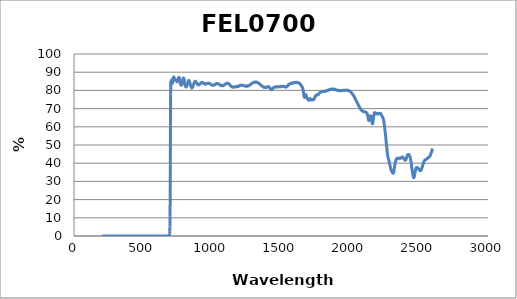
| Category | Series 0 |
|---|---|
| 2600.0 | 48.005 |
| 2599.0 | 47.872 |
| 2598.0 | 47.771 |
| 2597.0 | 47.591 |
| 2596.0 | 47.371 |
| 2595.0 | 47.221 |
| 2594.0 | 47.02 |
| 2593.0 | 46.818 |
| 2592.0 | 46.589 |
| 2591.0 | 46.38 |
| 2590.0 | 46.118 |
| 2589.0 | 45.875 |
| 2588.0 | 45.628 |
| 2587.0 | 45.402 |
| 2586.0 | 45.179 |
| 2585.0 | 44.964 |
| 2584.0 | 44.723 |
| 2583.0 | 44.506 |
| 2582.0 | 44.365 |
| 2581.0 | 44.17 |
| 2580.0 | 44.04 |
| 2579.0 | 43.906 |
| 2578.0 | 43.796 |
| 2577.0 | 43.674 |
| 2576.0 | 43.643 |
| 2575.0 | 43.505 |
| 2574.0 | 43.43 |
| 2573.0 | 43.443 |
| 2572.0 | 43.408 |
| 2571.0 | 43.345 |
| 2570.0 | 43.26 |
| 2569.0 | 43.187 |
| 2568.0 | 43.197 |
| 2567.0 | 43.044 |
| 2566.0 | 42.969 |
| 2565.0 | 42.871 |
| 2564.0 | 42.82 |
| 2563.0 | 42.755 |
| 2562.0 | 42.705 |
| 2561.0 | 42.603 |
| 2560.0 | 42.515 |
| 2559.0 | 42.503 |
| 2558.0 | 42.401 |
| 2557.0 | 42.373 |
| 2556.0 | 42.283 |
| 2555.0 | 42.256 |
| 2554.0 | 42.219 |
| 2553.0 | 42.184 |
| 2552.0 | 42.097 |
| 2551.0 | 42.037 |
| 2550.0 | 42.054 |
| 2549.0 | 42.051 |
| 2548.0 | 41.978 |
| 2547.0 | 41.938 |
| 2546.0 | 41.916 |
| 2545.0 | 41.809 |
| 2544.0 | 41.795 |
| 2543.0 | 41.687 |
| 2542.0 | 41.621 |
| 2541.0 | 41.537 |
| 2540.0 | 41.441 |
| 2539.0 | 41.293 |
| 2538.0 | 41.202 |
| 2537.0 | 41.012 |
| 2536.0 | 40.91 |
| 2535.0 | 40.717 |
| 2534.0 | 40.534 |
| 2533.0 | 40.259 |
| 2532.0 | 40.103 |
| 2531.0 | 39.814 |
| 2530.0 | 39.647 |
| 2529.0 | 39.354 |
| 2528.0 | 39.082 |
| 2527.0 | 38.84 |
| 2526.0 | 38.595 |
| 2525.0 | 38.302 |
| 2524.0 | 38.057 |
| 2523.0 | 37.806 |
| 2522.0 | 37.62 |
| 2521.0 | 37.328 |
| 2520.0 | 37.102 |
| 2519.0 | 36.885 |
| 2518.0 | 36.681 |
| 2517.0 | 36.505 |
| 2516.0 | 36.358 |
| 2515.0 | 36.166 |
| 2514.0 | 36.042 |
| 2513.0 | 35.998 |
| 2512.0 | 35.957 |
| 2511.0 | 35.893 |
| 2510.0 | 35.892 |
| 2509.0 | 35.866 |
| 2508.0 | 35.903 |
| 2507.0 | 35.905 |
| 2506.0 | 36.005 |
| 2505.0 | 36.111 |
| 2504.0 | 36.16 |
| 2503.0 | 36.238 |
| 2502.0 | 36.366 |
| 2501.0 | 36.418 |
| 2500.0 | 36.547 |
| 2499.0 | 36.677 |
| 2498.0 | 36.777 |
| 2497.0 | 36.83 |
| 2496.0 | 36.892 |
| 2495.0 | 37.019 |
| 2494.0 | 37.071 |
| 2493.0 | 37.173 |
| 2492.0 | 37.254 |
| 2491.0 | 37.316 |
| 2490.0 | 37.394 |
| 2489.0 | 37.493 |
| 2488.0 | 37.528 |
| 2487.0 | 37.571 |
| 2486.0 | 37.656 |
| 2485.0 | 37.662 |
| 2484.0 | 37.69 |
| 2483.0 | 37.7 |
| 2482.0 | 37.683 |
| 2481.0 | 37.59 |
| 2480.0 | 37.412 |
| 2479.0 | 37.259 |
| 2478.0 | 37.113 |
| 2477.0 | 36.78 |
| 2476.0 | 36.525 |
| 2475.0 | 36.191 |
| 2474.0 | 35.817 |
| 2473.0 | 35.444 |
| 2472.0 | 35.022 |
| 2471.0 | 34.652 |
| 2470.0 | 34.194 |
| 2469.0 | 33.805 |
| 2468.0 | 33.363 |
| 2467.0 | 32.94 |
| 2466.0 | 32.685 |
| 2465.0 | 32.392 |
| 2464.0 | 32.188 |
| 2463.0 | 32.063 |
| 2462.0 | 31.979 |
| 2461.0 | 32.038 |
| 2460.0 | 32.182 |
| 2459.0 | 32.41 |
| 2458.0 | 32.675 |
| 2457.0 | 33.006 |
| 2456.0 | 33.407 |
| 2455.0 | 33.879 |
| 2454.0 | 34.374 |
| 2453.0 | 34.839 |
| 2452.0 | 35.349 |
| 2451.0 | 35.854 |
| 2450.0 | 36.426 |
| 2449.0 | 36.967 |
| 2448.0 | 37.536 |
| 2447.0 | 38.135 |
| 2446.0 | 38.718 |
| 2445.0 | 39.308 |
| 2444.0 | 39.785 |
| 2443.0 | 40.401 |
| 2442.0 | 40.879 |
| 2441.0 | 41.401 |
| 2440.0 | 41.815 |
| 2439.0 | 42.241 |
| 2438.0 | 42.603 |
| 2437.0 | 42.917 |
| 2436.0 | 43.163 |
| 2435.0 | 43.418 |
| 2434.0 | 43.666 |
| 2433.0 | 43.901 |
| 2432.0 | 43.994 |
| 2431.0 | 44.245 |
| 2430.0 | 44.315 |
| 2429.0 | 44.448 |
| 2428.0 | 44.547 |
| 2427.0 | 44.669 |
| 2426.0 | 44.713 |
| 2425.0 | 44.789 |
| 2424.0 | 44.786 |
| 2423.0 | 44.801 |
| 2422.0 | 44.782 |
| 2421.0 | 44.771 |
| 2420.0 | 44.701 |
| 2419.0 | 44.695 |
| 2418.0 | 44.582 |
| 2417.0 | 44.453 |
| 2416.0 | 44.412 |
| 2415.0 | 44.256 |
| 2414.0 | 44.059 |
| 2413.0 | 43.908 |
| 2412.0 | 43.686 |
| 2411.0 | 43.456 |
| 2410.0 | 43.176 |
| 2409.0 | 42.955 |
| 2408.0 | 42.647 |
| 2407.0 | 42.386 |
| 2406.0 | 42.219 |
| 2405.0 | 41.949 |
| 2404.0 | 41.834 |
| 2403.0 | 41.672 |
| 2402.0 | 41.612 |
| 2401.0 | 41.582 |
| 2400.0 | 41.645 |
| 2399.0 | 41.666 |
| 2398.0 | 41.721 |
| 2397.0 | 41.854 |
| 2396.0 | 41.888 |
| 2395.0 | 42.018 |
| 2394.0 | 42.13 |
| 2393.0 | 42.253 |
| 2392.0 | 42.304 |
| 2391.0 | 42.448 |
| 2390.0 | 42.525 |
| 2389.0 | 42.6 |
| 2388.0 | 42.726 |
| 2387.0 | 42.806 |
| 2386.0 | 42.928 |
| 2385.0 | 43.014 |
| 2384.0 | 43.129 |
| 2383.0 | 43.171 |
| 2382.0 | 43.291 |
| 2381.0 | 43.361 |
| 2380.0 | 43.362 |
| 2379.0 | 43.436 |
| 2378.0 | 43.432 |
| 2377.0 | 43.395 |
| 2376.0 | 43.346 |
| 2375.0 | 43.308 |
| 2374.0 | 43.173 |
| 2373.0 | 43.153 |
| 2372.0 | 43.08 |
| 2371.0 | 43.033 |
| 2370.0 | 42.989 |
| 2369.0 | 42.909 |
| 2368.0 | 42.748 |
| 2367.0 | 42.768 |
| 2366.0 | 42.672 |
| 2365.0 | 42.643 |
| 2364.0 | 42.683 |
| 2363.0 | 42.692 |
| 2362.0 | 42.724 |
| 2361.0 | 42.775 |
| 2360.0 | 42.839 |
| 2359.0 | 42.799 |
| 2358.0 | 42.874 |
| 2357.0 | 42.816 |
| 2356.0 | 42.799 |
| 2355.0 | 42.73 |
| 2354.0 | 42.593 |
| 2353.0 | 42.553 |
| 2352.0 | 42.507 |
| 2351.0 | 42.449 |
| 2350.0 | 42.456 |
| 2349.0 | 42.505 |
| 2348.0 | 42.48 |
| 2347.0 | 42.568 |
| 2346.0 | 42.605 |
| 2345.0 | 42.582 |
| 2344.0 | 42.67 |
| 2343.0 | 42.698 |
| 2342.0 | 42.732 |
| 2341.0 | 42.723 |
| 2340.0 | 42.734 |
| 2339.0 | 42.681 |
| 2338.0 | 42.56 |
| 2337.0 | 42.512 |
| 2336.0 | 42.344 |
| 2335.0 | 42.177 |
| 2334.0 | 41.955 |
| 2333.0 | 41.695 |
| 2332.0 | 41.391 |
| 2331.0 | 41.151 |
| 2330.0 | 40.895 |
| 2329.0 | 40.585 |
| 2328.0 | 40.274 |
| 2327.0 | 39.89 |
| 2326.0 | 39.414 |
| 2325.0 | 39.023 |
| 2324.0 | 38.596 |
| 2323.0 | 38.038 |
| 2322.0 | 37.555 |
| 2321.0 | 37 |
| 2320.0 | 36.476 |
| 2319.0 | 35.925 |
| 2318.0 | 35.455 |
| 2317.0 | 35.081 |
| 2316.0 | 34.789 |
| 2315.0 | 34.597 |
| 2314.0 | 34.463 |
| 2313.0 | 34.446 |
| 2312.0 | 34.524 |
| 2311.0 | 34.551 |
| 2310.0 | 34.645 |
| 2309.0 | 34.761 |
| 2308.0 | 34.876 |
| 2307.0 | 35.02 |
| 2306.0 | 35.084 |
| 2305.0 | 35.18 |
| 2304.0 | 35.311 |
| 2303.0 | 35.458 |
| 2302.0 | 35.546 |
| 2301.0 | 35.7 |
| 2300.0 | 35.85 |
| 2299.0 | 36.049 |
| 2298.0 | 36.312 |
| 2297.0 | 36.51 |
| 2296.0 | 36.751 |
| 2295.0 | 37.062 |
| 2294.0 | 37.386 |
| 2293.0 | 37.659 |
| 2292.0 | 38.016 |
| 2291.0 | 38.338 |
| 2290.0 | 38.741 |
| 2289.0 | 39.044 |
| 2288.0 | 39.413 |
| 2287.0 | 39.741 |
| 2286.0 | 40.118 |
| 2285.0 | 40.458 |
| 2284.0 | 40.855 |
| 2283.0 | 41.158 |
| 2282.0 | 41.463 |
| 2281.0 | 41.737 |
| 2280.0 | 42.043 |
| 2279.0 | 42.338 |
| 2278.0 | 42.597 |
| 2277.0 | 42.827 |
| 2276.0 | 43.151 |
| 2275.0 | 43.437 |
| 2274.0 | 43.778 |
| 2273.0 | 44.267 |
| 2272.0 | 44.709 |
| 2271.0 | 45.294 |
| 2270.0 | 45.875 |
| 2269.0 | 46.54 |
| 2268.0 | 47.256 |
| 2267.0 | 48.064 |
| 2266.0 | 48.796 |
| 2265.0 | 49.593 |
| 2264.0 | 50.315 |
| 2263.0 | 51.122 |
| 2262.0 | 51.908 |
| 2261.0 | 52.751 |
| 2260.0 | 53.498 |
| 2259.0 | 54.155 |
| 2258.0 | 54.961 |
| 2257.0 | 55.673 |
| 2256.0 | 56.409 |
| 2255.0 | 57.168 |
| 2254.0 | 57.853 |
| 2253.0 | 58.53 |
| 2252.0 | 59.228 |
| 2251.0 | 59.81 |
| 2250.0 | 60.463 |
| 2249.0 | 61.03 |
| 2248.0 | 61.614 |
| 2247.0 | 62.042 |
| 2246.0 | 62.6 |
| 2245.0 | 63.003 |
| 2244.0 | 63.293 |
| 2243.0 | 63.746 |
| 2242.0 | 64.051 |
| 2241.0 | 64.3 |
| 2240.0 | 64.473 |
| 2239.0 | 64.732 |
| 2238.0 | 65.02 |
| 2237.0 | 65.159 |
| 2236.0 | 65.34 |
| 2235.0 | 65.382 |
| 2234.0 | 65.591 |
| 2233.0 | 65.599 |
| 2232.0 | 65.782 |
| 2231.0 | 66.002 |
| 2230.0 | 66.148 |
| 2229.0 | 66.279 |
| 2228.0 | 66.498 |
| 2227.0 | 66.676 |
| 2226.0 | 66.839 |
| 2225.0 | 66.953 |
| 2224.0 | 67.132 |
| 2223.0 | 67.263 |
| 2222.0 | 67.302 |
| 2221.0 | 67.324 |
| 2220.0 | 67.41 |
| 2219.0 | 67.435 |
| 2218.0 | 67.452 |
| 2217.0 | 67.377 |
| 2216.0 | 67.36 |
| 2215.0 | 67.268 |
| 2214.0 | 67.187 |
| 2213.0 | 67.15 |
| 2212.0 | 67.1 |
| 2211.0 | 67.075 |
| 2210.0 | 67.026 |
| 2209.0 | 66.987 |
| 2208.0 | 67.056 |
| 2207.0 | 66.998 |
| 2206.0 | 67.114 |
| 2205.0 | 67.158 |
| 2204.0 | 67.152 |
| 2203.0 | 67.212 |
| 2202.0 | 67.276 |
| 2201.0 | 67.324 |
| 2200.0 | 67.399 |
| 2199.0 | 67.334 |
| 2198.0 | 67.338 |
| 2197.0 | 67.428 |
| 2196.0 | 67.371 |
| 2195.0 | 67.3 |
| 2194.0 | 67.268 |
| 2193.0 | 67.147 |
| 2192.0 | 67.062 |
| 2191.0 | 67.048 |
| 2190.0 | 67.041 |
| 2189.0 | 67.078 |
| 2188.0 | 67.078 |
| 2187.0 | 67.239 |
| 2186.0 | 67.278 |
| 2185.0 | 67.366 |
| 2184.0 | 67.496 |
| 2183.0 | 67.616 |
| 2182.0 | 67.691 |
| 2181.0 | 67.715 |
| 2180.0 | 67.776 |
| 2179.0 | 67.8 |
| 2178.0 | 67.716 |
| 2177.0 | 67.682 |
| 2176.0 | 67.431 |
| 2175.0 | 67.24 |
| 2174.0 | 66.928 |
| 2173.0 | 66.609 |
| 2172.0 | 66.068 |
| 2171.0 | 65.523 |
| 2170.0 | 64.884 |
| 2169.0 | 64.275 |
| 2168.0 | 63.582 |
| 2167.0 | 63.087 |
| 2166.0 | 62.514 |
| 2165.0 | 62.077 |
| 2164.0 | 61.745 |
| 2163.0 | 61.68 |
| 2162.0 | 61.689 |
| 2161.0 | 61.878 |
| 2160.0 | 62.172 |
| 2159.0 | 62.5 |
| 2158.0 | 62.961 |
| 2157.0 | 63.424 |
| 2156.0 | 63.886 |
| 2155.0 | 64.446 |
| 2154.0 | 64.866 |
| 2153.0 | 65.165 |
| 2152.0 | 65.442 |
| 2151.0 | 65.713 |
| 2150.0 | 65.932 |
| 2149.0 | 65.964 |
| 2148.0 | 66.077 |
| 2147.0 | 65.932 |
| 2146.0 | 65.846 |
| 2145.0 | 65.553 |
| 2144.0 | 65.417 |
| 2143.0 | 65.137 |
| 2142.0 | 64.781 |
| 2141.0 | 64.513 |
| 2140.0 | 64.187 |
| 2139.0 | 63.833 |
| 2138.0 | 63.678 |
| 2137.0 | 63.483 |
| 2136.0 | 63.546 |
| 2135.0 | 63.517 |
| 2134.0 | 63.79 |
| 2133.0 | 64.045 |
| 2132.0 | 64.568 |
| 2131.0 | 64.995 |
| 2130.0 | 65.365 |
| 2129.0 | 65.842 |
| 2128.0 | 66.162 |
| 2127.0 | 66.497 |
| 2126.0 | 66.852 |
| 2125.0 | 67.043 |
| 2124.0 | 67.221 |
| 2123.0 | 67.312 |
| 2122.0 | 67.492 |
| 2121.0 | 67.577 |
| 2120.0 | 67.683 |
| 2119.0 | 67.688 |
| 2118.0 | 67.786 |
| 2117.0 | 67.884 |
| 2116.0 | 67.904 |
| 2115.0 | 68.036 |
| 2114.0 | 68.027 |
| 2113.0 | 68.081 |
| 2112.0 | 68.136 |
| 2111.0 | 68.063 |
| 2110.0 | 68.103 |
| 2109.0 | 68.208 |
| 2108.0 | 68.205 |
| 2107.0 | 68.229 |
| 2106.0 | 68.212 |
| 2105.0 | 68.352 |
| 2104.0 | 68.337 |
| 2103.0 | 68.29 |
| 2102.0 | 68.317 |
| 2101.0 | 68.365 |
| 2100.0 | 68.393 |
| 2099.0 | 68.356 |
| 2098.0 | 68.419 |
| 2097.0 | 68.348 |
| 2096.0 | 68.441 |
| 2095.0 | 68.508 |
| 2094.0 | 68.429 |
| 2093.0 | 68.491 |
| 2092.0 | 68.562 |
| 2091.0 | 68.584 |
| 2090.0 | 68.651 |
| 2089.0 | 68.684 |
| 2088.0 | 68.753 |
| 2087.0 | 68.837 |
| 2086.0 | 68.848 |
| 2085.0 | 68.889 |
| 2084.0 | 69.011 |
| 2083.0 | 69.076 |
| 2082.0 | 69.14 |
| 2081.0 | 69.232 |
| 2080.0 | 69.317 |
| 2079.0 | 69.428 |
| 2078.0 | 69.642 |
| 2077.0 | 69.693 |
| 2076.0 | 69.792 |
| 2075.0 | 69.958 |
| 2074.0 | 70.125 |
| 2073.0 | 70.219 |
| 2072.0 | 70.399 |
| 2071.0 | 70.462 |
| 2070.0 | 70.624 |
| 2069.0 | 70.715 |
| 2068.0 | 70.865 |
| 2067.0 | 71.117 |
| 2066.0 | 71.068 |
| 2065.0 | 71.383 |
| 2064.0 | 71.507 |
| 2063.0 | 71.568 |
| 2062.0 | 71.785 |
| 2061.0 | 71.902 |
| 2060.0 | 72.089 |
| 2059.0 | 72.25 |
| 2058.0 | 72.427 |
| 2057.0 | 72.591 |
| 2056.0 | 72.646 |
| 2055.0 | 72.813 |
| 2054.0 | 72.994 |
| 2053.0 | 73.104 |
| 2052.0 | 73.25 |
| 2051.0 | 73.439 |
| 2050.0 | 73.537 |
| 2049.0 | 73.744 |
| 2048.0 | 73.848 |
| 2047.0 | 74.077 |
| 2046.0 | 74.175 |
| 2045.0 | 74.265 |
| 2044.0 | 74.44 |
| 2043.0 | 74.574 |
| 2042.0 | 74.87 |
| 2041.0 | 75.032 |
| 2040.0 | 75.082 |
| 2039.0 | 75.145 |
| 2038.0 | 75.369 |
| 2037.0 | 75.576 |
| 2036.0 | 75.699 |
| 2035.0 | 75.789 |
| 2034.0 | 75.959 |
| 2033.0 | 76.138 |
| 2032.0 | 76.259 |
| 2031.0 | 76.422 |
| 2030.0 | 76.529 |
| 2029.0 | 76.672 |
| 2028.0 | 76.878 |
| 2027.0 | 76.995 |
| 2026.0 | 77.076 |
| 2025.0 | 77.293 |
| 2024.0 | 77.362 |
| 2023.0 | 77.363 |
| 2022.0 | 77.604 |
| 2021.0 | 77.661 |
| 2020.0 | 77.731 |
| 2019.0 | 77.876 |
| 2018.0 | 78.019 |
| 2017.0 | 78.057 |
| 2016.0 | 78.212 |
| 2015.0 | 78.304 |
| 2014.0 | 78.284 |
| 2013.0 | 78.539 |
| 2012.0 | 78.564 |
| 2011.0 | 78.768 |
| 2010.0 | 78.783 |
| 2009.0 | 78.826 |
| 2008.0 | 78.839 |
| 2007.0 | 79.016 |
| 2006.0 | 79.032 |
| 2005.0 | 79.103 |
| 2004.0 | 79.228 |
| 2003.0 | 79.293 |
| 2002.0 | 79.388 |
| 2001.0 | 79.481 |
| 2000.0 | 79.426 |
| 1999.0 | 79.423 |
| 1998.0 | 79.58 |
| 1997.0 | 79.651 |
| 1996.0 | 79.625 |
| 1995.0 | 79.729 |
| 1994.0 | 79.75 |
| 1993.0 | 79.876 |
| 1992.0 | 79.841 |
| 1991.0 | 79.901 |
| 1990.0 | 79.976 |
| 1989.0 | 79.983 |
| 1988.0 | 80.054 |
| 1987.0 | 80.055 |
| 1986.0 | 80.041 |
| 1985.0 | 80.083 |
| 1984.0 | 80.149 |
| 1983.0 | 80.104 |
| 1982.0 | 79.99 |
| 1981.0 | 80.106 |
| 1980.0 | 80.067 |
| 1979.0 | 80.119 |
| 1978.0 | 80.024 |
| 1977.0 | 80.178 |
| 1976.0 | 80.076 |
| 1975.0 | 80.145 |
| 1974.0 | 80.121 |
| 1973.0 | 80.062 |
| 1972.0 | 80.157 |
| 1971.0 | 80.106 |
| 1970.0 | 80.124 |
| 1969.0 | 80.076 |
| 1968.0 | 80.088 |
| 1967.0 | 80.12 |
| 1966.0 | 80.107 |
| 1965.0 | 80.075 |
| 1964.0 | 80.048 |
| 1963.0 | 80.065 |
| 1962.0 | 80.119 |
| 1961.0 | 79.999 |
| 1960.0 | 80.009 |
| 1959.0 | 80.069 |
| 1958.0 | 80.117 |
| 1957.0 | 80.044 |
| 1956.0 | 80.044 |
| 1955.0 | 80.049 |
| 1954.0 | 80.023 |
| 1953.0 | 80.086 |
| 1952.0 | 79.985 |
| 1951.0 | 80.039 |
| 1950.0 | 80.06 |
| 1949.0 | 79.972 |
| 1948.0 | 79.922 |
| 1947.0 | 79.941 |
| 1946.0 | 79.96 |
| 1945.0 | 79.992 |
| 1944.0 | 79.952 |
| 1943.0 | 79.903 |
| 1942.0 | 79.973 |
| 1941.0 | 79.866 |
| 1940.0 | 79.845 |
| 1939.0 | 79.882 |
| 1938.0 | 79.896 |
| 1937.0 | 79.868 |
| 1936.0 | 79.86 |
| 1935.0 | 79.808 |
| 1934.0 | 79.761 |
| 1933.0 | 79.794 |
| 1932.0 | 79.881 |
| 1931.0 | 79.806 |
| 1930.0 | 79.779 |
| 1929.0 | 79.843 |
| 1928.0 | 79.862 |
| 1927.0 | 79.897 |
| 1926.0 | 79.799 |
| 1925.0 | 79.757 |
| 1924.0 | 79.883 |
| 1923.0 | 79.906 |
| 1922.0 | 79.838 |
| 1921.0 | 79.9 |
| 1920.0 | 79.873 |
| 1919.0 | 79.934 |
| 1918.0 | 79.892 |
| 1917.0 | 79.966 |
| 1916.0 | 79.909 |
| 1915.0 | 79.887 |
| 1914.0 | 79.905 |
| 1913.0 | 79.959 |
| 1912.0 | 79.93 |
| 1911.0 | 80.115 |
| 1910.0 | 79.988 |
| 1909.0 | 80.031 |
| 1908.0 | 80.079 |
| 1907.0 | 79.996 |
| 1906.0 | 80.084 |
| 1905.0 | 80.124 |
| 1904.0 | 80.082 |
| 1903.0 | 80.227 |
| 1902.0 | 80.181 |
| 1901.0 | 80.175 |
| 1900.0 | 80.275 |
| 1899.0 | 80.255 |
| 1898.0 | 80.282 |
| 1897.0 | 80.386 |
| 1896.0 | 80.382 |
| 1895.0 | 80.449 |
| 1894.0 | 80.49 |
| 1893.0 | 80.539 |
| 1892.0 | 80.426 |
| 1891.0 | 80.617 |
| 1890.0 | 80.658 |
| 1889.0 | 80.597 |
| 1888.0 | 80.547 |
| 1887.0 | 80.634 |
| 1886.0 | 80.664 |
| 1885.0 | 80.632 |
| 1884.0 | 80.624 |
| 1883.0 | 80.8 |
| 1882.0 | 80.758 |
| 1881.0 | 80.621 |
| 1880.0 | 80.681 |
| 1879.0 | 80.665 |
| 1878.0 | 80.618 |
| 1877.0 | 80.665 |
| 1876.0 | 80.786 |
| 1875.0 | 80.697 |
| 1874.0 | 80.66 |
| 1873.0 | 80.691 |
| 1872.0 | 80.619 |
| 1871.0 | 80.701 |
| 1870.0 | 80.672 |
| 1869.0 | 80.619 |
| 1868.0 | 80.732 |
| 1867.0 | 80.64 |
| 1866.0 | 80.7 |
| 1865.0 | 80.674 |
| 1864.0 | 80.602 |
| 1863.0 | 80.606 |
| 1862.0 | 80.57 |
| 1861.0 | 80.571 |
| 1860.0 | 80.538 |
| 1859.0 | 80.64 |
| 1858.0 | 80.544 |
| 1857.0 | 80.607 |
| 1856.0 | 80.52 |
| 1855.0 | 80.437 |
| 1854.0 | 80.416 |
| 1853.0 | 80.36 |
| 1852.0 | 80.404 |
| 1851.0 | 80.333 |
| 1850.0 | 80.348 |
| 1849.0 | 80.312 |
| 1848.0 | 80.266 |
| 1847.0 | 80.169 |
| 1846.0 | 80.209 |
| 1845.0 | 80.219 |
| 1844.0 | 80.236 |
| 1843.0 | 80.044 |
| 1842.0 | 80.1 |
| 1841.0 | 79.996 |
| 1840.0 | 80.069 |
| 1839.0 | 80.047 |
| 1838.0 | 79.964 |
| 1837.0 | 80.116 |
| 1836.0 | 79.915 |
| 1835.0 | 79.979 |
| 1834.0 | 79.952 |
| 1833.0 | 79.813 |
| 1832.0 | 79.86 |
| 1831.0 | 79.743 |
| 1830.0 | 79.808 |
| 1829.0 | 79.699 |
| 1828.0 | 79.706 |
| 1827.0 | 79.649 |
| 1826.0 | 79.672 |
| 1825.0 | 79.628 |
| 1824.0 | 79.635 |
| 1823.0 | 79.724 |
| 1822.0 | 79.566 |
| 1821.0 | 79.621 |
| 1820.0 | 79.669 |
| 1819.0 | 79.556 |
| 1818.0 | 79.511 |
| 1817.0 | 79.552 |
| 1816.0 | 79.606 |
| 1815.0 | 79.515 |
| 1814.0 | 79.413 |
| 1813.0 | 79.526 |
| 1812.0 | 79.518 |
| 1811.0 | 79.421 |
| 1810.0 | 79.504 |
| 1809.0 | 79.427 |
| 1808.0 | 79.447 |
| 1807.0 | 79.469 |
| 1806.0 | 79.498 |
| 1805.0 | 79.431 |
| 1804.0 | 79.354 |
| 1803.0 | 79.381 |
| 1802.0 | 79.354 |
| 1801.0 | 79.313 |
| 1800.0 | 79.448 |
| 1799.0 | 79.295 |
| 1798.0 | 79.311 |
| 1797.0 | 79.357 |
| 1796.0 | 79.271 |
| 1795.0 | 79.306 |
| 1794.0 | 79.24 |
| 1793.0 | 79.268 |
| 1792.0 | 79.195 |
| 1791.0 | 79.209 |
| 1790.0 | 79.114 |
| 1789.0 | 79.085 |
| 1788.0 | 79.12 |
| 1787.0 | 79.059 |
| 1786.0 | 78.983 |
| 1785.0 | 78.964 |
| 1784.0 | 78.904 |
| 1783.0 | 78.852 |
| 1782.0 | 78.75 |
| 1781.0 | 78.736 |
| 1780.0 | 78.715 |
| 1779.0 | 78.554 |
| 1778.0 | 78.458 |
| 1777.0 | 78.346 |
| 1776.0 | 78.249 |
| 1775.0 | 78.134 |
| 1774.0 | 78.031 |
| 1773.0 | 77.897 |
| 1772.0 | 77.844 |
| 1771.0 | 77.758 |
| 1770.0 | 77.747 |
| 1769.0 | 77.622 |
| 1768.0 | 77.55 |
| 1767.0 | 77.609 |
| 1766.0 | 77.601 |
| 1765.0 | 77.652 |
| 1764.0 | 77.584 |
| 1763.0 | 77.515 |
| 1762.0 | 77.668 |
| 1761.0 | 77.557 |
| 1760.0 | 77.448 |
| 1759.0 | 77.563 |
| 1758.0 | 77.497 |
| 1757.0 | 77.515 |
| 1756.0 | 77.446 |
| 1755.0 | 77.346 |
| 1754.0 | 77.318 |
| 1753.0 | 77.223 |
| 1752.0 | 77.167 |
| 1751.0 | 76.999 |
| 1750.0 | 76.925 |
| 1749.0 | 76.769 |
| 1748.0 | 76.59 |
| 1747.0 | 76.539 |
| 1746.0 | 76.285 |
| 1745.0 | 76.165 |
| 1744.0 | 75.957 |
| 1743.0 | 75.821 |
| 1742.0 | 75.688 |
| 1741.0 | 75.503 |
| 1740.0 | 75.357 |
| 1739.0 | 75.278 |
| 1738.0 | 75.053 |
| 1737.0 | 74.911 |
| 1736.0 | 75.032 |
| 1735.0 | 74.914 |
| 1734.0 | 74.844 |
| 1733.0 | 74.865 |
| 1732.0 | 74.9 |
| 1731.0 | 74.912 |
| 1730.0 | 74.942 |
| 1729.0 | 74.914 |
| 1728.0 | 74.817 |
| 1727.0 | 74.864 |
| 1726.0 | 74.763 |
| 1725.0 | 74.697 |
| 1724.0 | 74.715 |
| 1723.0 | 74.712 |
| 1722.0 | 74.865 |
| 1721.0 | 74.744 |
| 1720.0 | 74.809 |
| 1719.0 | 74.854 |
| 1718.0 | 75.013 |
| 1717.0 | 75.078 |
| 1716.0 | 75.201 |
| 1715.0 | 75.265 |
| 1714.0 | 75.39 |
| 1713.0 | 75.406 |
| 1712.0 | 75.418 |
| 1711.0 | 75.471 |
| 1710.0 | 75.364 |
| 1709.0 | 75.241 |
| 1708.0 | 75.181 |
| 1707.0 | 75.063 |
| 1706.0 | 75.025 |
| 1705.0 | 74.953 |
| 1704.0 | 74.807 |
| 1703.0 | 74.68 |
| 1702.0 | 74.647 |
| 1701.0 | 74.575 |
| 1700.0 | 74.548 |
| 1699.0 | 74.636 |
| 1698.0 | 74.771 |
| 1697.0 | 74.93 |
| 1696.0 | 75.22 |
| 1695.0 | 75.317 |
| 1694.0 | 75.562 |
| 1693.0 | 75.555 |
| 1692.0 | 75.579 |
| 1691.0 | 75.506 |
| 1690.0 | 75.64 |
| 1689.0 | 75.63 |
| 1688.0 | 75.778 |
| 1687.0 | 75.882 |
| 1686.0 | 76.177 |
| 1685.0 | 76.599 |
| 1684.0 | 76.818 |
| 1683.0 | 77.112 |
| 1682.0 | 77.379 |
| 1681.0 | 77.582 |
| 1680.0 | 77.693 |
| 1679.0 | 77.627 |
| 1678.0 | 77.566 |
| 1677.0 | 77.385 |
| 1676.0 | 77.18 |
| 1675.0 | 76.944 |
| 1674.0 | 76.714 |
| 1673.0 | 76.385 |
| 1672.0 | 76.386 |
| 1671.0 | 76.152 |
| 1670.0 | 76.128 |
| 1669.0 | 76.29 |
| 1668.0 | 76.551 |
| 1667.0 | 76.936 |
| 1666.0 | 77.31 |
| 1665.0 | 77.791 |
| 1664.0 | 78.39 |
| 1663.0 | 78.913 |
| 1662.0 | 79.533 |
| 1661.0 | 79.893 |
| 1660.0 | 80.282 |
| 1659.0 | 80.63 |
| 1658.0 | 80.961 |
| 1657.0 | 81.218 |
| 1656.0 | 81.497 |
| 1655.0 | 81.707 |
| 1654.0 | 81.9 |
| 1653.0 | 81.963 |
| 1652.0 | 82.161 |
| 1651.0 | 82.228 |
| 1650.0 | 82.203 |
| 1649.0 | 82.288 |
| 1648.0 | 82.361 |
| 1647.0 | 82.595 |
| 1646.0 | 82.669 |
| 1645.0 | 82.758 |
| 1644.0 | 83.022 |
| 1643.0 | 83.111 |
| 1642.0 | 83.346 |
| 1641.0 | 83.432 |
| 1640.0 | 83.552 |
| 1639.0 | 83.563 |
| 1638.0 | 83.495 |
| 1637.0 | 83.676 |
| 1636.0 | 83.75 |
| 1635.0 | 83.67 |
| 1634.0 | 83.766 |
| 1633.0 | 83.818 |
| 1632.0 | 83.92 |
| 1631.0 | 83.915 |
| 1630.0 | 84.023 |
| 1629.0 | 84.006 |
| 1628.0 | 84.175 |
| 1627.0 | 84.209 |
| 1626.0 | 84.126 |
| 1625.0 | 84.202 |
| 1624.0 | 84.214 |
| 1623.0 | 84.289 |
| 1622.0 | 84.186 |
| 1621.0 | 84.228 |
| 1620.0 | 84.336 |
| 1619.0 | 84.328 |
| 1618.0 | 84.183 |
| 1617.0 | 84.456 |
| 1616.0 | 84.281 |
| 1615.0 | 84.387 |
| 1614.0 | 84.332 |
| 1613.0 | 84.468 |
| 1612.0 | 84.398 |
| 1611.0 | 84.395 |
| 1610.0 | 84.445 |
| 1609.0 | 84.392 |
| 1608.0 | 84.369 |
| 1607.0 | 84.393 |
| 1606.0 | 84.384 |
| 1605.0 | 84.359 |
| 1604.0 | 84.341 |
| 1603.0 | 84.341 |
| 1602.0 | 84.417 |
| 1601.0 | 84.347 |
| 1600.0 | 84.345 |
| 1599.0 | 84.297 |
| 1598.0 | 84.327 |
| 1597.0 | 84.251 |
| 1596.0 | 84.302 |
| 1595.0 | 84.295 |
| 1594.0 | 84.256 |
| 1593.0 | 84.177 |
| 1592.0 | 84.308 |
| 1591.0 | 84.139 |
| 1590.0 | 84.251 |
| 1589.0 | 84.17 |
| 1588.0 | 84.181 |
| 1587.0 | 84.154 |
| 1586.0 | 84.092 |
| 1585.0 | 84.043 |
| 1584.0 | 84.138 |
| 1583.0 | 83.93 |
| 1582.0 | 83.966 |
| 1581.0 | 84.033 |
| 1580.0 | 83.924 |
| 1579.0 | 83.907 |
| 1578.0 | 83.89 |
| 1577.0 | 83.846 |
| 1576.0 | 83.9 |
| 1575.0 | 83.835 |
| 1574.0 | 83.883 |
| 1573.0 | 83.872 |
| 1572.0 | 83.844 |
| 1571.0 | 83.857 |
| 1570.0 | 83.764 |
| 1569.0 | 83.678 |
| 1568.0 | 83.611 |
| 1567.0 | 83.685 |
| 1566.0 | 83.615 |
| 1565.0 | 83.549 |
| 1564.0 | 83.485 |
| 1563.0 | 83.532 |
| 1562.0 | 83.418 |
| 1561.0 | 83.349 |
| 1560.0 | 83.411 |
| 1559.0 | 83.292 |
| 1558.0 | 83.316 |
| 1557.0 | 83.202 |
| 1556.0 | 83.201 |
| 1555.0 | 83.059 |
| 1554.0 | 83.067 |
| 1553.0 | 83.001 |
| 1552.0 | 82.899 |
| 1551.0 | 82.669 |
| 1550.0 | 82.709 |
| 1549.0 | 82.525 |
| 1548.0 | 82.509 |
| 1547.0 | 82.444 |
| 1546.0 | 82.285 |
| 1545.0 | 82.305 |
| 1544.0 | 82.167 |
| 1543.0 | 82.06 |
| 1542.0 | 82.168 |
| 1541.0 | 82.013 |
| 1540.0 | 81.954 |
| 1539.0 | 81.935 |
| 1538.0 | 81.956 |
| 1537.0 | 81.946 |
| 1536.0 | 81.772 |
| 1535.0 | 81.828 |
| 1534.0 | 81.843 |
| 1533.0 | 81.83 |
| 1532.0 | 81.87 |
| 1531.0 | 81.945 |
| 1530.0 | 81.924 |
| 1529.0 | 81.972 |
| 1528.0 | 81.955 |
| 1527.0 | 82.124 |
| 1526.0 | 82.031 |
| 1525.0 | 82.055 |
| 1524.0 | 81.987 |
| 1523.0 | 82.051 |
| 1522.0 | 82.09 |
| 1521.0 | 82.071 |
| 1520.0 | 82.107 |
| 1519.0 | 82.111 |
| 1518.0 | 82.12 |
| 1517.0 | 82.108 |
| 1516.0 | 82.22 |
| 1515.0 | 82.28 |
| 1514.0 | 82.165 |
| 1513.0 | 82.18 |
| 1512.0 | 82.161 |
| 1511.0 | 82.283 |
| 1510.0 | 82.194 |
| 1509.0 | 82.126 |
| 1508.0 | 82.116 |
| 1507.0 | 82.226 |
| 1506.0 | 82.203 |
| 1505.0 | 82.181 |
| 1504.0 | 82.053 |
| 1503.0 | 82.075 |
| 1502.0 | 82.178 |
| 1501.0 | 82.117 |
| 1500.0 | 82.152 |
| 1499.0 | 82.132 |
| 1498.0 | 82.056 |
| 1497.0 | 82.008 |
| 1496.0 | 82.188 |
| 1495.0 | 82.102 |
| 1494.0 | 82.114 |
| 1493.0 | 82.041 |
| 1492.0 | 81.877 |
| 1491.0 | 82.003 |
| 1490.0 | 82.013 |
| 1489.0 | 82.066 |
| 1488.0 | 82.08 |
| 1487.0 | 82.072 |
| 1486.0 | 82.012 |
| 1485.0 | 82.098 |
| 1484.0 | 81.995 |
| 1483.0 | 82.017 |
| 1482.0 | 81.995 |
| 1481.0 | 82.022 |
| 1480.0 | 81.967 |
| 1479.0 | 82.009 |
| 1478.0 | 81.917 |
| 1477.0 | 82.013 |
| 1476.0 | 81.972 |
| 1475.0 | 81.847 |
| 1474.0 | 81.952 |
| 1473.0 | 81.861 |
| 1472.0 | 82.014 |
| 1471.0 | 82.006 |
| 1470.0 | 81.902 |
| 1469.0 | 81.988 |
| 1468.0 | 81.898 |
| 1467.0 | 81.97 |
| 1466.0 | 81.885 |
| 1465.0 | 81.948 |
| 1464.0 | 82.023 |
| 1463.0 | 81.953 |
| 1462.0 | 81.881 |
| 1461.0 | 81.883 |
| 1460.0 | 81.841 |
| 1459.0 | 81.839 |
| 1458.0 | 81.862 |
| 1457.0 | 81.748 |
| 1456.0 | 81.916 |
| 1455.0 | 81.773 |
| 1454.0 | 81.843 |
| 1453.0 | 81.712 |
| 1452.0 | 81.751 |
| 1451.0 | 81.656 |
| 1450.0 | 81.608 |
| 1449.0 | 81.619 |
| 1448.0 | 81.459 |
| 1447.0 | 81.584 |
| 1446.0 | 81.471 |
| 1445.0 | 81.427 |
| 1444.0 | 81.418 |
| 1443.0 | 81.228 |
| 1442.0 | 81.194 |
| 1441.0 | 81.005 |
| 1440.0 | 81.048 |
| 1439.0 | 81.036 |
| 1438.0 | 80.902 |
| 1437.0 | 80.874 |
| 1436.0 | 80.772 |
| 1435.0 | 80.685 |
| 1434.0 | 80.65 |
| 1433.0 | 80.52 |
| 1432.0 | 80.543 |
| 1431.0 | 80.371 |
| 1430.0 | 80.415 |
| 1429.0 | 80.52 |
| 1428.0 | 80.465 |
| 1427.0 | 80.507 |
| 1426.0 | 80.541 |
| 1425.0 | 80.618 |
| 1424.0 | 80.715 |
| 1423.0 | 80.779 |
| 1422.0 | 80.957 |
| 1421.0 | 81.05 |
| 1420.0 | 81.273 |
| 1419.0 | 81.345 |
| 1418.0 | 81.395 |
| 1417.0 | 81.615 |
| 1416.0 | 81.702 |
| 1415.0 | 81.769 |
| 1414.0 | 81.843 |
| 1413.0 | 81.816 |
| 1412.0 | 81.871 |
| 1411.0 | 81.924 |
| 1410.0 | 82.077 |
| 1409.0 | 81.988 |
| 1408.0 | 82.011 |
| 1407.0 | 81.884 |
| 1406.0 | 82.045 |
| 1405.0 | 82.019 |
| 1404.0 | 81.959 |
| 1403.0 | 82.048 |
| 1402.0 | 81.944 |
| 1401.0 | 81.932 |
| 1400.0 | 81.826 |
| 1399.0 | 81.839 |
| 1398.0 | 81.788 |
| 1397.0 | 81.782 |
| 1396.0 | 81.654 |
| 1395.0 | 81.719 |
| 1394.0 | 81.653 |
| 1393.0 | 81.704 |
| 1392.0 | 81.665 |
| 1391.0 | 81.657 |
| 1390.0 | 81.565 |
| 1389.0 | 81.592 |
| 1388.0 | 81.687 |
| 1387.0 | 81.662 |
| 1386.0 | 81.677 |
| 1385.0 | 81.609 |
| 1384.0 | 81.696 |
| 1383.0 | 81.564 |
| 1382.0 | 81.638 |
| 1381.0 | 81.654 |
| 1380.0 | 81.597 |
| 1379.0 | 81.671 |
| 1378.0 | 81.599 |
| 1377.0 | 81.767 |
| 1376.0 | 81.762 |
| 1375.0 | 81.69 |
| 1374.0 | 81.861 |
| 1373.0 | 81.789 |
| 1372.0 | 81.984 |
| 1371.0 | 82.029 |
| 1370.0 | 82.01 |
| 1369.0 | 82.119 |
| 1368.0 | 82.081 |
| 1367.0 | 82.175 |
| 1366.0 | 82.272 |
| 1365.0 | 82.226 |
| 1364.0 | 82.357 |
| 1363.0 | 82.412 |
| 1362.0 | 82.361 |
| 1361.0 | 82.422 |
| 1360.0 | 82.543 |
| 1359.0 | 82.582 |
| 1358.0 | 82.565 |
| 1357.0 | 82.667 |
| 1356.0 | 82.747 |
| 1355.0 | 82.894 |
| 1354.0 | 82.906 |
| 1353.0 | 83.017 |
| 1352.0 | 83.113 |
| 1351.0 | 83.179 |
| 1350.0 | 83.26 |
| 1349.0 | 83.286 |
| 1348.0 | 83.378 |
| 1347.0 | 83.429 |
| 1346.0 | 83.57 |
| 1345.0 | 83.602 |
| 1344.0 | 83.654 |
| 1343.0 | 83.681 |
| 1342.0 | 83.709 |
| 1341.0 | 83.777 |
| 1340.0 | 83.82 |
| 1339.0 | 83.936 |
| 1338.0 | 83.92 |
| 1337.0 | 83.99 |
| 1336.0 | 84.052 |
| 1335.0 | 84.049 |
| 1334.0 | 84.207 |
| 1333.0 | 84.072 |
| 1332.0 | 84.137 |
| 1331.0 | 84.176 |
| 1330.0 | 84.346 |
| 1329.0 | 84.305 |
| 1328.0 | 84.321 |
| 1327.0 | 84.361 |
| 1326.0 | 84.469 |
| 1325.0 | 84.505 |
| 1324.0 | 84.391 |
| 1323.0 | 84.552 |
| 1322.0 | 84.517 |
| 1321.0 | 84.457 |
| 1320.0 | 84.49 |
| 1319.0 | 84.49 |
| 1318.0 | 84.526 |
| 1317.0 | 84.548 |
| 1316.0 | 84.65 |
| 1315.0 | 84.564 |
| 1314.0 | 84.537 |
| 1313.0 | 84.517 |
| 1312.0 | 84.541 |
| 1311.0 | 84.545 |
| 1310.0 | 84.583 |
| 1309.0 | 84.43 |
| 1308.0 | 84.498 |
| 1307.0 | 84.477 |
| 1306.0 | 84.466 |
| 1305.0 | 84.529 |
| 1304.0 | 84.386 |
| 1303.0 | 84.411 |
| 1302.0 | 84.395 |
| 1301.0 | 84.375 |
| 1300.0 | 84.297 |
| 1299.0 | 84.298 |
| 1298.0 | 84.255 |
| 1297.0 | 84.14 |
| 1296.0 | 84.229 |
| 1295.0 | 84.024 |
| 1294.0 | 84.077 |
| 1293.0 | 84.026 |
| 1292.0 | 84.007 |
| 1291.0 | 83.921 |
| 1290.0 | 83.909 |
| 1289.0 | 83.807 |
| 1288.0 | 83.803 |
| 1287.0 | 83.747 |
| 1286.0 | 83.69 |
| 1285.0 | 83.697 |
| 1284.0 | 83.571 |
| 1283.0 | 83.473 |
| 1282.0 | 83.391 |
| 1281.0 | 83.413 |
| 1280.0 | 83.37 |
| 1279.0 | 83.274 |
| 1278.0 | 83.234 |
| 1277.0 | 83.16 |
| 1276.0 | 83.076 |
| 1275.0 | 82.98 |
| 1274.0 | 82.939 |
| 1273.0 | 82.86 |
| 1272.0 | 82.886 |
| 1271.0 | 82.951 |
| 1270.0 | 82.867 |
| 1269.0 | 82.766 |
| 1268.0 | 82.606 |
| 1267.0 | 82.705 |
| 1266.0 | 82.618 |
| 1265.0 | 82.577 |
| 1264.0 | 82.593 |
| 1263.0 | 82.469 |
| 1262.0 | 82.46 |
| 1261.0 | 82.456 |
| 1260.0 | 82.384 |
| 1259.0 | 82.391 |
| 1258.0 | 82.324 |
| 1257.0 | 82.5 |
| 1256.0 | 82.394 |
| 1255.0 | 82.304 |
| 1254.0 | 82.345 |
| 1253.0 | 82.311 |
| 1252.0 | 82.244 |
| 1251.0 | 82.299 |
| 1250.0 | 82.291 |
| 1249.0 | 82.39 |
| 1248.0 | 82.275 |
| 1247.0 | 82.29 |
| 1246.0 | 82.249 |
| 1245.0 | 82.366 |
| 1244.0 | 82.349 |
| 1243.0 | 82.384 |
| 1242.0 | 82.428 |
| 1241.0 | 82.473 |
| 1240.0 | 82.399 |
| 1239.0 | 82.42 |
| 1238.0 | 82.414 |
| 1237.0 | 82.482 |
| 1236.0 | 82.494 |
| 1235.0 | 82.442 |
| 1234.0 | 82.553 |
| 1233.0 | 82.468 |
| 1232.0 | 82.543 |
| 1231.0 | 82.702 |
| 1230.0 | 82.562 |
| 1229.0 | 82.636 |
| 1228.0 | 82.722 |
| 1227.0 | 82.695 |
| 1226.0 | 82.777 |
| 1225.0 | 82.742 |
| 1224.0 | 82.755 |
| 1223.0 | 82.76 |
| 1222.0 | 82.879 |
| 1221.0 | 82.778 |
| 1220.0 | 82.791 |
| 1219.0 | 82.873 |
| 1218.0 | 82.759 |
| 1217.0 | 82.869 |
| 1216.0 | 82.811 |
| 1215.0 | 82.9 |
| 1214.0 | 82.916 |
| 1213.0 | 82.923 |
| 1212.0 | 83.002 |
| 1211.0 | 82.86 |
| 1210.0 | 82.886 |
| 1209.0 | 82.912 |
| 1208.0 | 82.869 |
| 1207.0 | 82.893 |
| 1206.0 | 82.827 |
| 1205.0 | 82.776 |
| 1204.0 | 82.862 |
| 1203.0 | 82.804 |
| 1202.0 | 82.743 |
| 1201.0 | 82.764 |
| 1200.0 | 82.71 |
| 1199.0 | 82.647 |
| 1198.0 | 82.538 |
| 1197.0 | 82.428 |
| 1196.0 | 82.36 |
| 1195.0 | 82.386 |
| 1194.0 | 82.306 |
| 1193.0 | 82.21 |
| 1192.0 | 82.19 |
| 1191.0 | 82.208 |
| 1190.0 | 82.102 |
| 1189.0 | 82.06 |
| 1188.0 | 82.116 |
| 1187.0 | 82.106 |
| 1186.0 | 82.22 |
| 1185.0 | 82.116 |
| 1184.0 | 82.187 |
| 1183.0 | 82.143 |
| 1182.0 | 82.06 |
| 1181.0 | 82.196 |
| 1180.0 | 82.182 |
| 1179.0 | 82.023 |
| 1178.0 | 82.108 |
| 1177.0 | 82.024 |
| 1176.0 | 81.988 |
| 1175.0 | 81.931 |
| 1174.0 | 82.006 |
| 1173.0 | 81.942 |
| 1172.0 | 81.971 |
| 1171.0 | 81.978 |
| 1170.0 | 82.022 |
| 1169.0 | 81.977 |
| 1168.0 | 81.926 |
| 1167.0 | 82.009 |
| 1166.0 | 81.872 |
| 1165.0 | 81.909 |
| 1164.0 | 81.973 |
| 1163.0 | 81.863 |
| 1162.0 | 81.808 |
| 1161.0 | 81.763 |
| 1160.0 | 81.899 |
| 1159.0 | 81.806 |
| 1158.0 | 81.838 |
| 1157.0 | 81.745 |
| 1156.0 | 81.888 |
| 1155.0 | 81.799 |
| 1154.0 | 81.826 |
| 1153.0 | 81.738 |
| 1152.0 | 81.855 |
| 1151.0 | 81.801 |
| 1150.0 | 81.886 |
| 1149.0 | 81.922 |
| 1148.0 | 81.888 |
| 1147.0 | 81.831 |
| 1146.0 | 81.961 |
| 1145.0 | 81.993 |
| 1144.0 | 82.093 |
| 1143.0 | 82.101 |
| 1142.0 | 82.011 |
| 1141.0 | 82.125 |
| 1140.0 | 82.163 |
| 1139.0 | 82.186 |
| 1138.0 | 82.246 |
| 1137.0 | 82.371 |
| 1136.0 | 82.324 |
| 1135.0 | 82.563 |
| 1134.0 | 82.554 |
| 1133.0 | 82.668 |
| 1132.0 | 82.725 |
| 1131.0 | 82.904 |
| 1130.0 | 82.977 |
| 1129.0 | 83.119 |
| 1128.0 | 83.185 |
| 1127.0 | 83.246 |
| 1126.0 | 83.381 |
| 1125.0 | 83.315 |
| 1124.0 | 83.528 |
| 1123.0 | 83.559 |
| 1122.0 | 83.656 |
| 1121.0 | 83.692 |
| 1120.0 | 83.804 |
| 1119.0 | 83.821 |
| 1118.0 | 83.814 |
| 1117.0 | 83.805 |
| 1116.0 | 83.945 |
| 1115.0 | 84.012 |
| 1114.0 | 83.951 |
| 1113.0 | 83.859 |
| 1112.0 | 83.964 |
| 1111.0 | 83.906 |
| 1110.0 | 83.846 |
| 1109.0 | 83.816 |
| 1108.0 | 83.909 |
| 1107.0 | 83.959 |
| 1106.0 | 83.912 |
| 1105.0 | 83.809 |
| 1104.0 | 83.787 |
| 1103.0 | 83.846 |
| 1102.0 | 83.648 |
| 1101.0 | 83.635 |
| 1100.0 | 83.669 |
| 1099.0 | 83.595 |
| 1098.0 | 83.503 |
| 1097.0 | 83.465 |
| 1096.0 | 83.377 |
| 1095.0 | 83.371 |
| 1094.0 | 83.256 |
| 1093.0 | 83.141 |
| 1092.0 | 83.165 |
| 1091.0 | 83.182 |
| 1090.0 | 82.985 |
| 1089.0 | 82.966 |
| 1088.0 | 82.961 |
| 1087.0 | 82.919 |
| 1086.0 | 82.819 |
| 1085.0 | 82.868 |
| 1084.0 | 82.741 |
| 1083.0 | 82.726 |
| 1082.0 | 82.746 |
| 1081.0 | 82.702 |
| 1080.0 | 82.59 |
| 1079.0 | 82.621 |
| 1078.0 | 82.621 |
| 1077.0 | 82.542 |
| 1076.0 | 82.673 |
| 1075.0 | 82.522 |
| 1074.0 | 82.625 |
| 1073.0 | 82.531 |
| 1072.0 | 82.578 |
| 1071.0 | 82.584 |
| 1070.0 | 82.52 |
| 1069.0 | 82.632 |
| 1068.0 | 82.625 |
| 1067.0 | 82.606 |
| 1066.0 | 82.793 |
| 1065.0 | 82.769 |
| 1064.0 | 82.777 |
| 1063.0 | 82.82 |
| 1062.0 | 82.846 |
| 1061.0 | 82.931 |
| 1060.0 | 82.889 |
| 1059.0 | 82.94 |
| 1058.0 | 83.005 |
| 1057.0 | 83.091 |
| 1056.0 | 83.137 |
| 1055.0 | 83.169 |
| 1054.0 | 83.203 |
| 1053.0 | 83.216 |
| 1052.0 | 83.34 |
| 1051.0 | 83.404 |
| 1050.0 | 83.501 |
| 1049.0 | 83.464 |
| 1048.0 | 83.474 |
| 1047.0 | 83.531 |
| 1046.0 | 83.652 |
| 1045.0 | 83.627 |
| 1044.0 | 83.654 |
| 1043.0 | 83.669 |
| 1042.0 | 83.696 |
| 1041.0 | 83.724 |
| 1040.0 | 83.709 |
| 1039.0 | 83.706 |
| 1038.0 | 83.768 |
| 1037.0 | 83.735 |
| 1036.0 | 83.693 |
| 1035.0 | 83.824 |
| 1034.0 | 83.767 |
| 1033.0 | 83.623 |
| 1032.0 | 83.662 |
| 1031.0 | 83.629 |
| 1030.0 | 83.589 |
| 1029.0 | 83.493 |
| 1028.0 | 83.496 |
| 1027.0 | 83.421 |
| 1026.0 | 83.438 |
| 1025.0 | 83.547 |
| 1024.0 | 83.281 |
| 1023.0 | 83.315 |
| 1022.0 | 83.295 |
| 1021.0 | 83.248 |
| 1020.0 | 83.175 |
| 1019.0 | 83.136 |
| 1018.0 | 83.108 |
| 1017.0 | 82.985 |
| 1016.0 | 83.102 |
| 1015.0 | 82.919 |
| 1014.0 | 82.922 |
| 1013.0 | 82.901 |
| 1012.0 | 82.768 |
| 1011.0 | 82.834 |
| 1010.0 | 82.908 |
| 1009.0 | 82.83 |
| 1008.0 | 82.848 |
| 1007.0 | 82.8 |
| 1006.0 | 82.891 |
| 1005.0 | 82.845 |
| 1004.0 | 82.855 |
| 1003.0 | 82.837 |
| 1002.0 | 82.928 |
| 1001.0 | 82.856 |
| 1000.0 | 82.987 |
| 999.0 | 82.99 |
| 998.0 | 83.064 |
| 997.0 | 83.102 |
| 996.0 | 83.105 |
| 995.0 | 83.161 |
| 994.0 | 83.233 |
| 993.0 | 83.295 |
| 992.0 | 83.277 |
| 991.0 | 83.403 |
| 990.0 | 83.388 |
| 989.0 | 83.473 |
| 988.0 | 83.555 |
| 987.0 | 83.586 |
| 986.0 | 83.677 |
| 985.0 | 83.623 |
| 984.0 | 83.801 |
| 983.0 | 83.652 |
| 982.0 | 83.809 |
| 981.0 | 83.861 |
| 980.0 | 83.906 |
| 979.0 | 83.961 |
| 978.0 | 83.938 |
| 977.0 | 83.862 |
| 976.0 | 83.925 |
| 975.0 | 83.99 |
| 974.0 | 83.996 |
| 973.0 | 83.995 |
| 972.0 | 83.928 |
| 971.0 | 83.988 |
| 970.0 | 83.939 |
| 969.0 | 83.917 |
| 968.0 | 83.924 |
| 967.0 | 83.854 |
| 966.0 | 83.957 |
| 965.0 | 83.89 |
| 964.0 | 83.799 |
| 963.0 | 83.832 |
| 962.0 | 83.754 |
| 961.0 | 83.674 |
| 960.0 | 83.714 |
| 959.0 | 83.64 |
| 958.0 | 83.608 |
| 957.0 | 83.619 |
| 956.0 | 83.475 |
| 955.0 | 83.579 |
| 954.0 | 83.547 |
| 953.0 | 83.566 |
| 952.0 | 83.568 |
| 951.0 | 83.528 |
| 950.0 | 83.595 |
| 949.0 | 83.415 |
| 948.0 | 83.566 |
| 947.0 | 83.62 |
| 946.0 | 83.657 |
| 945.0 | 83.656 |
| 944.0 | 83.695 |
| 943.0 | 83.879 |
| 942.0 | 83.738 |
| 941.0 | 83.823 |
| 940.0 | 83.928 |
| 939.0 | 84.029 |
| 938.0 | 84.046 |
| 937.0 | 84.011 |
| 936.0 | 84.043 |
| 935.0 | 84.164 |
| 934.0 | 84.257 |
| 933.0 | 84.144 |
| 932.0 | 84.262 |
| 931.0 | 84.287 |
| 930.0 | 84.312 |
| 929.0 | 84.412 |
| 928.0 | 84.358 |
| 927.0 | 84.368 |
| 926.0 | 84.267 |
| 925.0 | 84.335 |
| 924.0 | 84.34 |
| 923.0 | 84.253 |
| 922.0 | 84.292 |
| 921.0 | 84.195 |
| 920.0 | 84.009 |
| 919.0 | 83.884 |
| 918.0 | 83.895 |
| 917.0 | 83.881 |
| 916.0 | 83.805 |
| 915.0 | 83.608 |
| 914.0 | 83.589 |
| 913.0 | 83.621 |
| 912.0 | 83.392 |
| 911.0 | 83.399 |
| 910.0 | 83.268 |
| 909.0 | 83.273 |
| 908.0 | 83.154 |
| 907.0 | 83.225 |
| 906.0 | 83.069 |
| 905.0 | 83.046 |
| 904.0 | 83.03 |
| 903.0 | 83.07 |
| 902.0 | 82.996 |
| 901.0 | 83.064 |
| 900.0 | 83.119 |
| 899.0 | 83.179 |
| 898.0 | 83.161 |
| 897.0 | 83.174 |
| 896.0 | 83.221 |
| 895.0 | 83.308 |
| 894.0 | 83.572 |
| 893.0 | 83.684 |
| 892.0 | 83.659 |
| 891.0 | 83.869 |
| 890.0 | 83.989 |
| 889.0 | 84.073 |
| 888.0 | 84.23 |
| 887.0 | 84.4 |
| 886.0 | 84.47 |
| 885.0 | 84.628 |
| 884.0 | 84.696 |
| 883.0 | 84.808 |
| 882.0 | 84.8 |
| 881.0 | 84.884 |
| 880.0 | 84.967 |
| 879.0 | 85 |
| 878.0 | 84.967 |
| 877.0 | 84.877 |
| 876.0 | 84.846 |
| 875.0 | 84.771 |
| 874.0 | 84.605 |
| 873.0 | 84.45 |
| 872.0 | 84.342 |
| 871.0 | 84.196 |
| 870.0 | 83.914 |
| 869.0 | 83.734 |
| 868.0 | 83.56 |
| 867.0 | 83.258 |
| 866.0 | 83.141 |
| 865.0 | 82.895 |
| 864.0 | 82.72 |
| 863.0 | 82.485 |
| 862.0 | 82.305 |
| 861.0 | 82.115 |
| 860.0 | 81.887 |
| 859.0 | 81.717 |
| 858.0 | 81.58 |
| 857.0 | 81.515 |
| 856.0 | 81.445 |
| 855.0 | 81.491 |
| 854.0 | 81.354 |
| 853.0 | 81.348 |
| 852.0 | 81.433 |
| 851.0 | 81.539 |
| 850.0 | 81.748 |
| 849.0 | 81.877 |
| 848.0 | 82.082 |
| 847.0 | 82.243 |
| 846.0 | 82.501 |
| 845.0 | 82.74 |
| 844.0 | 82.934 |
| 843.0 | 83.169 |
| 842.0 | 83.554 |
| 841.0 | 83.863 |
| 840.0 | 84.123 |
| 839.0 | 84.407 |
| 838.0 | 84.5 |
| 837.0 | 84.861 |
| 836.0 | 84.996 |
| 835.0 | 85.159 |
| 834.0 | 85.305 |
| 833.0 | 85.441 |
| 832.0 | 85.449 |
| 831.0 | 85.499 |
| 830.0 | 85.374 |
| 829.0 | 85.249 |
| 828.0 | 85.11 |
| 827.0 | 84.955 |
| 826.0 | 84.767 |
| 825.0 | 84.497 |
| 824.0 | 84.228 |
| 823.0 | 83.924 |
| 822.0 | 83.67 |
| 821.0 | 83.424 |
| 820.0 | 83.098 |
| 819.0 | 82.844 |
| 818.0 | 82.603 |
| 817.0 | 82.412 |
| 816.0 | 82.166 |
| 815.0 | 82.084 |
| 814.0 | 81.888 |
| 813.0 | 81.858 |
| 812.0 | 81.807 |
| 811.0 | 81.836 |
| 810.0 | 81.967 |
| 809.0 | 82.037 |
| 808.0 | 82.138 |
| 807.0 | 82.483 |
| 806.0 | 82.632 |
| 805.0 | 82.959 |
| 804.0 | 83.22 |
| 803.0 | 83.53 |
| 802.0 | 83.895 |
| 801.0 | 84.217 |
| 800.0 | 84.546 |
| 799.0 | 85.735 |
| 798.0 | 86.094 |
| 797.0 | 86.407 |
| 796.0 | 86.553 |
| 795.0 | 86.71 |
| 794.0 | 86.828 |
| 793.0 | 86.809 |
| 792.0 | 86.699 |
| 791.0 | 86.597 |
| 790.0 | 86.35 |
| 789.0 | 86.09 |
| 788.0 | 85.76 |
| 787.0 | 85.375 |
| 786.0 | 84.994 |
| 785.0 | 84.645 |
| 784.0 | 84.292 |
| 783.0 | 83.883 |
| 782.0 | 83.55 |
| 781.0 | 83.321 |
| 780.0 | 83.069 |
| 779.0 | 82.851 |
| 778.0 | 82.797 |
| 777.0 | 82.77 |
| 776.0 | 82.847 |
| 775.0 | 82.942 |
| 774.0 | 83.1 |
| 773.0 | 83.38 |
| 772.0 | 83.714 |
| 771.0 | 84.08 |
| 770.0 | 84.51 |
| 769.0 | 84.907 |
| 768.0 | 85.371 |
| 767.0 | 85.757 |
| 766.0 | 86.178 |
| 765.0 | 86.477 |
| 764.0 | 86.742 |
| 763.0 | 86.993 |
| 762.0 | 87.097 |
| 761.0 | 87.171 |
| 760.0 | 87.156 |
| 759.0 | 87.032 |
| 758.0 | 86.838 |
| 757.0 | 86.68 |
| 756.0 | 86.376 |
| 755.0 | 86.07 |
| 754.0 | 85.794 |
| 753.0 | 85.522 |
| 752.0 | 85.286 |
| 751.0 | 85.046 |
| 750.0 | 84.837 |
| 749.0 | 84.795 |
| 748.0 | 84.716 |
| 747.0 | 84.727 |
| 746.0 | 84.795 |
| 745.0 | 84.88 |
| 744.0 | 85.047 |
| 743.0 | 85.242 |
| 742.0 | 85.384 |
| 741.0 | 85.575 |
| 740.0 | 85.7 |
| 739.0 | 85.832 |
| 738.0 | 85.9 |
| 737.0 | 85.994 |
| 736.0 | 85.998 |
| 735.0 | 85.963 |
| 734.0 | 85.949 |
| 733.0 | 85.924 |
| 732.0 | 85.882 |
| 731.0 | 86.002 |
| 730.0 | 86.044 |
| 729.0 | 86.244 |
| 728.0 | 86.415 |
| 727.0 | 86.636 |
| 726.0 | 86.892 |
| 725.0 | 87.087 |
| 724.0 | 87.33 |
| 723.0 | 87.42 |
| 722.0 | 87.313 |
| 721.0 | 87.1 |
| 720.0 | 86.735 |
| 719.0 | 86.239 |
| 718.0 | 85.688 |
| 717.0 | 85.041 |
| 716.0 | 84.531 |
| 715.0 | 84.146 |
| 714.0 | 83.941 |
| 713.0 | 84.035 |
| 712.0 | 84.375 |
| 711.0 | 84.873 |
| 710.0 | 85.439 |
| 709.0 | 85.817 |
| 708.0 | 85.82 |
| 707.0 | 85.436 |
| 706.0 | 84.635 |
| 705.0 | 83.754 |
| 704.0 | 83.255 |
| 703.0 | 83.72 |
| 702.0 | 84.897 |
| 701.0 | 84.515 |
| 700.0 | 77.607 |
| 699.0 | 60.915 |
| 698.0 | 39.377 |
| 697.0 | 21.422 |
| 696.0 | 10.563 |
| 695.0 | 5.162 |
| 694.0 | 2.578 |
| 693.0 | 1.348 |
| 692.0 | 0.732 |
| 691.0 | 0.411 |
| 690.0 | 0.24 |
| 689.0 | 0.143 |
| 688.0 | 0.088 |
| 687.0 | 0.055 |
| 686.0 | 0.034 |
| 685.0 | 0.022 |
| 684.0 | 0.015 |
| 683.0 | 0.01 |
| 682.0 | 0.007 |
| 681.0 | 0.005 |
| 680.0 | 0.003 |
| 679.0 | 0.002 |
| 678.0 | 0.002 |
| 677.0 | 0.001 |
| 676.0 | 0.001 |
| 675.0 | 0.001 |
| 674.0 | 0 |
| 673.0 | 0 |
| 672.0 | 0 |
| 671.0 | 0 |
| 670.0 | 0 |
| 669.0 | 0 |
| 668.0 | 0 |
| 667.0 | 0 |
| 666.0 | 0 |
| 665.0 | 0 |
| 664.0 | 0 |
| 663.0 | 0 |
| 662.0 | 0 |
| 661.0 | 0 |
| 660.0 | 0 |
| 659.0 | 0 |
| 658.0 | 0 |
| 657.0 | 0 |
| 656.0 | 0 |
| 655.0 | 0 |
| 654.0 | 0 |
| 653.0 | 0 |
| 652.0 | 0 |
| 651.0 | 0 |
| 650.0 | 0 |
| 649.0 | 0 |
| 648.0 | 0 |
| 647.0 | 0 |
| 646.0 | 0 |
| 645.0 | 0 |
| 644.0 | 0 |
| 643.0 | 0 |
| 642.0 | 0 |
| 641.0 | 0 |
| 640.0 | 0 |
| 639.0 | 0 |
| 638.0 | 0 |
| 637.0 | 0 |
| 636.0 | 0 |
| 635.0 | 0 |
| 634.0 | 0 |
| 633.0 | 0 |
| 632.0 | 0 |
| 631.0 | 0 |
| 630.0 | 0 |
| 629.0 | 0 |
| 628.0 | 0 |
| 627.0 | 0 |
| 626.0 | 0 |
| 625.0 | 0 |
| 624.0 | 0 |
| 623.0 | 0 |
| 622.0 | 0 |
| 621.0 | 0 |
| 620.0 | 0 |
| 619.0 | 0 |
| 618.0 | 0 |
| 617.0 | 0 |
| 616.0 | 0 |
| 615.0 | 0 |
| 614.0 | 0 |
| 613.0 | 0 |
| 612.0 | 0 |
| 611.0 | 0 |
| 610.0 | 0 |
| 609.0 | 0 |
| 608.0 | 0 |
| 607.0 | 0 |
| 606.0 | 0 |
| 605.0 | 0 |
| 604.0 | 0 |
| 603.0 | 0 |
| 602.0 | 0 |
| 601.0 | 0 |
| 600.0 | 0 |
| 599.0 | 0 |
| 598.0 | 0 |
| 597.0 | 0 |
| 596.0 | 0 |
| 595.0 | 0 |
| 594.0 | 0 |
| 593.0 | 0 |
| 592.0 | 0 |
| 591.0 | 0 |
| 590.0 | 0 |
| 589.0 | 0 |
| 588.0 | 0 |
| 587.0 | 0 |
| 586.0 | 0 |
| 585.0 | 0 |
| 584.0 | 0 |
| 583.0 | 0 |
| 582.0 | 0 |
| 581.0 | 0 |
| 580.0 | 0 |
| 579.0 | 0 |
| 578.0 | 0 |
| 577.0 | 0 |
| 576.0 | 0 |
| 575.0 | 0 |
| 574.0 | 0 |
| 573.0 | 0 |
| 572.0 | 0 |
| 571.0 | 0 |
| 570.0 | 0 |
| 569.0 | 0 |
| 568.0 | 0 |
| 567.0 | 0 |
| 566.0 | 0 |
| 565.0 | 0 |
| 564.0 | 0 |
| 563.0 | 0 |
| 562.0 | 0 |
| 561.0 | 0 |
| 560.0 | 0 |
| 559.0 | 0 |
| 558.0 | 0 |
| 557.0 | 0 |
| 556.0 | 0 |
| 555.0 | 0 |
| 554.0 | 0 |
| 553.0 | 0 |
| 552.0 | 0 |
| 551.0 | 0 |
| 550.0 | 0 |
| 549.0 | 0 |
| 548.0 | 0 |
| 547.0 | 0 |
| 546.0 | 0 |
| 545.0 | 0 |
| 544.0 | 0 |
| 543.0 | 0 |
| 542.0 | 0 |
| 541.0 | 0 |
| 540.0 | 0 |
| 539.0 | 0 |
| 538.0 | 0 |
| 537.0 | 0 |
| 536.0 | 0 |
| 535.0 | 0 |
| 534.0 | 0 |
| 533.0 | 0 |
| 532.0 | 0 |
| 531.0 | 0 |
| 530.0 | 0 |
| 529.0 | 0 |
| 528.0 | 0 |
| 527.0 | 0 |
| 526.0 | 0 |
| 525.0 | 0 |
| 524.0 | 0 |
| 523.0 | 0 |
| 522.0 | 0 |
| 521.0 | 0 |
| 520.0 | 0 |
| 519.0 | 0 |
| 518.0 | 0 |
| 517.0 | 0 |
| 516.0 | 0 |
| 515.0 | 0 |
| 514.0 | 0 |
| 513.0 | 0 |
| 512.0 | 0 |
| 511.0 | 0 |
| 510.0 | 0 |
| 509.0 | 0 |
| 508.0 | 0 |
| 507.0 | 0 |
| 506.0 | 0 |
| 505.0 | 0 |
| 504.0 | 0 |
| 503.0 | 0 |
| 502.0 | 0 |
| 501.0 | 0 |
| 500.0 | 0 |
| 499.0 | 0 |
| 498.0 | 0 |
| 497.0 | 0 |
| 496.0 | 0 |
| 495.0 | 0 |
| 494.0 | 0 |
| 493.0 | 0 |
| 492.0 | 0 |
| 491.0 | 0 |
| 490.0 | 0 |
| 489.0 | 0 |
| 488.0 | 0 |
| 487.0 | 0 |
| 486.0 | 0 |
| 485.0 | 0 |
| 484.0 | 0 |
| 483.0 | 0 |
| 482.0 | 0 |
| 481.0 | 0 |
| 480.0 | 0 |
| 479.0 | 0 |
| 478.0 | 0 |
| 477.0 | 0 |
| 476.0 | 0 |
| 475.0 | 0 |
| 474.0 | 0 |
| 473.0 | 0 |
| 472.0 | 0 |
| 471.0 | 0 |
| 470.0 | 0 |
| 469.0 | 0 |
| 468.0 | 0 |
| 467.0 | 0 |
| 466.0 | 0 |
| 465.0 | 0 |
| 464.0 | 0 |
| 463.0 | 0 |
| 462.0 | 0 |
| 461.0 | 0 |
| 460.0 | 0 |
| 459.0 | 0 |
| 458.0 | 0 |
| 457.0 | 0 |
| 456.0 | 0 |
| 455.0 | 0 |
| 454.0 | 0 |
| 453.0 | 0 |
| 452.0 | 0 |
| 451.0 | 0 |
| 450.0 | 0 |
| 449.0 | 0 |
| 448.0 | 0 |
| 447.0 | 0 |
| 446.0 | 0 |
| 445.0 | 0 |
| 444.0 | 0 |
| 443.0 | 0 |
| 442.0 | 0 |
| 441.0 | 0 |
| 440.0 | 0 |
| 439.0 | 0 |
| 438.0 | 0 |
| 437.0 | 0 |
| 436.0 | 0 |
| 435.0 | 0 |
| 434.0 | 0 |
| 433.0 | 0 |
| 432.0 | 0 |
| 431.0 | 0 |
| 430.0 | 0 |
| 429.0 | 0 |
| 428.0 | 0 |
| 427.0 | 0 |
| 426.0 | 0 |
| 425.0 | 0 |
| 424.0 | 0 |
| 423.0 | 0 |
| 422.0 | 0 |
| 421.0 | 0 |
| 420.0 | 0 |
| 419.0 | 0 |
| 418.0 | 0 |
| 417.0 | 0 |
| 416.0 | 0 |
| 415.0 | 0 |
| 414.0 | 0 |
| 413.0 | 0 |
| 412.0 | 0 |
| 411.0 | 0 |
| 410.0 | 0 |
| 409.0 | 0 |
| 408.0 | 0 |
| 407.0 | 0 |
| 406.0 | 0 |
| 405.0 | 0 |
| 404.0 | 0 |
| 403.0 | 0 |
| 402.0 | 0 |
| 401.0 | 0 |
| 400.0 | 0 |
| 399.0 | 0 |
| 398.0 | 0 |
| 397.0 | 0 |
| 396.0 | 0 |
| 395.0 | 0 |
| 394.0 | 0 |
| 393.0 | 0 |
| 392.0 | 0 |
| 391.0 | 0 |
| 390.0 | 0 |
| 389.0 | 0 |
| 388.0 | 0 |
| 387.0 | 0 |
| 386.0 | 0 |
| 385.0 | 0 |
| 384.0 | 0 |
| 383.0 | 0 |
| 382.0 | 0 |
| 381.0 | 0 |
| 380.0 | 0 |
| 379.0 | 0 |
| 378.0 | 0 |
| 377.0 | 0 |
| 376.0 | 0 |
| 375.0 | 0 |
| 374.0 | 0 |
| 373.0 | 0 |
| 372.0 | 0 |
| 371.0 | 0 |
| 370.0 | 0 |
| 369.0 | 0 |
| 368.0 | 0 |
| 367.0 | 0 |
| 366.0 | 0 |
| 365.0 | 0 |
| 364.0 | 0 |
| 363.0 | 0 |
| 362.0 | 0 |
| 361.0 | 0 |
| 360.0 | 0 |
| 359.0 | 0 |
| 358.0 | 0 |
| 357.0 | 0 |
| 356.0 | 0 |
| 355.0 | 0 |
| 354.0 | 0 |
| 353.0 | 0 |
| 352.0 | 0 |
| 351.0 | 0 |
| 350.0 | 0 |
| 349.0 | 0 |
| 348.0 | 0 |
| 347.0 | 0 |
| 346.0 | 0 |
| 345.0 | 0 |
| 344.0 | 0 |
| 343.0 | 0 |
| 342.0 | 0 |
| 341.0 | 0 |
| 340.0 | 0 |
| 339.0 | 0 |
| 338.0 | 0 |
| 337.0 | 0 |
| 336.0 | 0 |
| 335.0 | 0 |
| 334.0 | 0 |
| 333.0 | 0 |
| 332.0 | 0 |
| 331.0 | 0 |
| 330.0 | 0 |
| 329.0 | 0 |
| 328.0 | 0 |
| 327.0 | 0 |
| 326.0 | 0 |
| 325.0 | 0 |
| 324.0 | 0 |
| 323.0 | 0 |
| 322.0 | 0 |
| 321.0 | 0 |
| 320.0 | 0 |
| 319.0 | 0 |
| 318.0 | 0 |
| 317.0 | 0 |
| 316.0 | 0 |
| 315.0 | 0 |
| 314.0 | 0 |
| 313.0 | 0 |
| 312.0 | 0 |
| 311.0 | 0 |
| 310.0 | 0 |
| 309.0 | 0 |
| 308.0 | 0 |
| 307.0 | 0 |
| 306.0 | 0 |
| 305.0 | 0 |
| 304.0 | 0 |
| 303.0 | 0 |
| 302.0 | 0 |
| 301.0 | 0 |
| 300.0 | 0 |
| 299.0 | 0 |
| 298.0 | 0 |
| 297.0 | 0 |
| 296.0 | 0 |
| 295.0 | 0 |
| 294.0 | 0 |
| 293.0 | 0 |
| 292.0 | 0 |
| 291.0 | 0 |
| 290.0 | 0 |
| 289.0 | 0 |
| 288.0 | 0 |
| 287.0 | 0 |
| 286.0 | 0 |
| 285.0 | 0 |
| 284.0 | 0 |
| 283.0 | 0 |
| 282.0 | 0 |
| 281.0 | 0 |
| 280.0 | 0 |
| 279.0 | 0 |
| 278.0 | 0 |
| 277.0 | 0 |
| 276.0 | 0 |
| 275.0 | 0 |
| 274.0 | 0 |
| 273.0 | 0 |
| 272.0 | 0 |
| 271.0 | 0 |
| 270.0 | 0 |
| 269.0 | 0 |
| 268.0 | 0 |
| 267.0 | 0 |
| 266.0 | 0 |
| 265.0 | 0 |
| 264.0 | 0 |
| 263.0 | 0 |
| 262.0 | 0 |
| 261.0 | 0 |
| 260.0 | 0 |
| 259.0 | 0 |
| 258.0 | 0 |
| 257.0 | 0 |
| 256.0 | 0 |
| 255.0 | 0 |
| 254.0 | 0 |
| 253.0 | 0 |
| 252.0 | 0 |
| 251.0 | 0 |
| 250.0 | 0 |
| 249.0 | 0 |
| 248.0 | 0 |
| 247.0 | 0 |
| 246.0 | 0 |
| 245.0 | 0 |
| 244.0 | 0 |
| 243.0 | 0 |
| 242.0 | 0 |
| 241.0 | 0 |
| 240.0 | 0 |
| 239.0 | 0 |
| 238.0 | 0 |
| 237.0 | 0 |
| 236.0 | 0 |
| 235.0 | 0 |
| 234.0 | 0 |
| 233.0 | 0 |
| 232.0 | 0 |
| 231.0 | 0 |
| 230.0 | 0 |
| 229.0 | 0 |
| 228.0 | 0 |
| 227.0 | 0 |
| 226.0 | 0 |
| 225.0 | 0 |
| 224.0 | 0 |
| 223.0 | 0 |
| 222.0 | 0 |
| 221.0 | 0 |
| 220.0 | 0 |
| 219.0 | 0 |
| 218.0 | 0 |
| 217.0 | 0 |
| 216.0 | 0 |
| 215.0 | 0 |
| 214.0 | 0 |
| 213.0 | 0 |
| 212.0 | 0 |
| 211.0 | 0 |
| 210.0 | 0 |
| 209.0 | 0 |
| 208.0 | 0 |
| 207.0 | 0 |
| 206.0 | 0 |
| 205.0 | 0 |
| 204.0 | 0 |